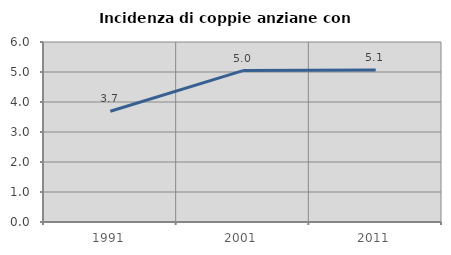
| Category | Incidenza di coppie anziane con figli |
|---|---|
| 1991.0 | 3.691 |
| 2001.0 | 5.046 |
| 2011.0 | 5.071 |